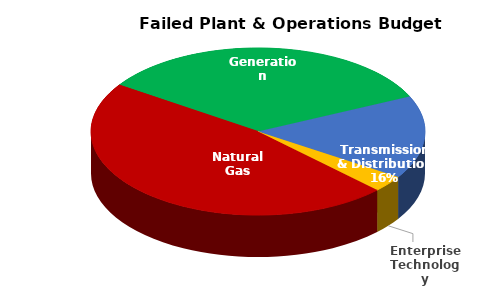
| Category | Series 2 | Series 1 | Series 0 |
|---|---|---|---|
| Enterprise Technology | 2716400 | 26775000 | 182621615 |
| Natural Gas | 40000000 | 10860000 | 26710000 |
| Generation | 28651680 | 218982538 | 4790000 |
| Transmission & Distribution | 13672000 | 92547338 | 76335166 |